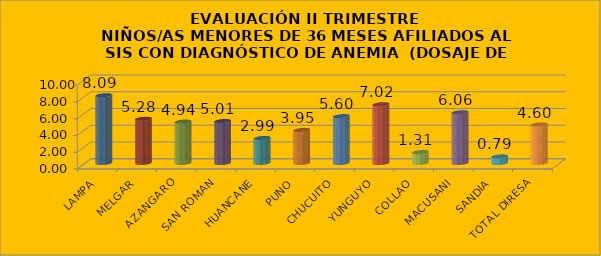
| Category | Series 0 |
|---|---|
| LAMPA | 8.094 |
| MELGAR | 5.276 |
| AZANGARO | 4.944 |
| SAN ROMAN | 5.013 |
| HUANCANE | 2.992 |
| PUNO | 3.95 |
| CHUCUITO | 5.597 |
| YUNGUYO | 7.018 |
| COLLAO | 1.315 |
| MACUSANI | 6.06 |
| SANDIA | 0.789 |
| TOTAL DIRESA | 4.598 |